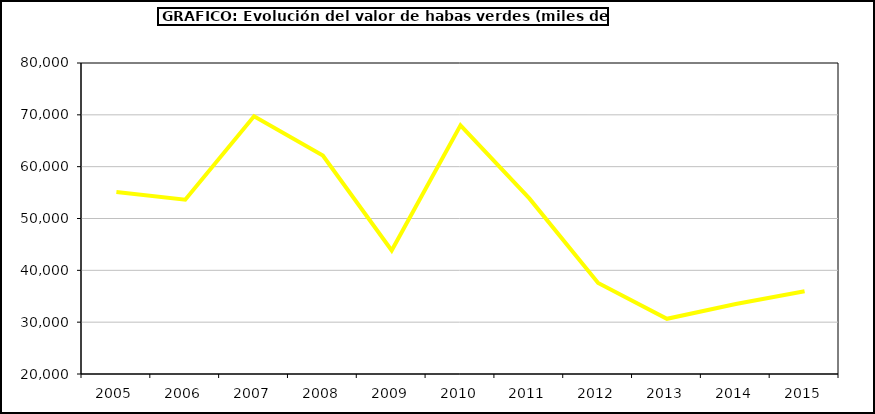
| Category | Valor |
|---|---|
| 2005.0 | 55120.332 |
| 2006.0 | 53633.866 |
| 2007.0 | 69730.927 |
| 2008.0 | 62129.509 |
| 2009.0 | 43829.181 |
| 2010.0 | 67988.319 |
| 2011.0 | 53880.612 |
| 2012.0 | 37566.616 |
| 2013.0 | 30653.095 |
| 2014.0 | 33509.136 |
| 2015.0 | 35980 |